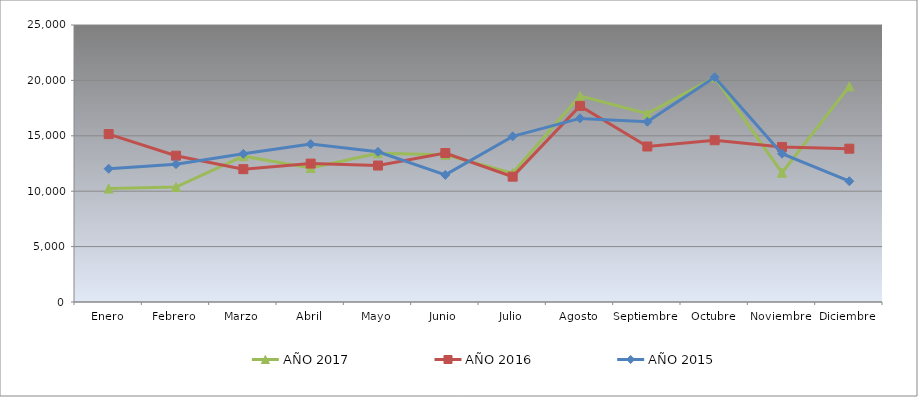
| Category | AÑO 2017 | AÑO 2016 | AÑO 2015 |
|---|---|---|---|
| Enero | 10243.412 | 15154.688 | 12028.259 |
| Febrero | 10379.393 | 13205.748 | 12439.656 |
| Marzo | 13163.385 | 11989.951 | 13373.323 |
| Abril | 12103.746 | 12492.46 | 14251.554 |
| Mayo | 13418.71 | 12316.048 | 13558.598 |
| Junio | 13282.729 | 13445.547 | 11470.976 |
| Julio | 11635.046 | 11313.321 | 14950.346 |
| Agosto | 18601.897 | 17697.779 | 16571.133 |
| Septiembre | 17003.398 | 14035.116 | 16269.15 |
| Octubre | 20261.153 | 14602.539 | 20288.296 |
| Noviembre | 11672.658 | 13993.877 | 13386.453 |
| Diciembre | 19461.18 | 13836.557 | 10900.564 |